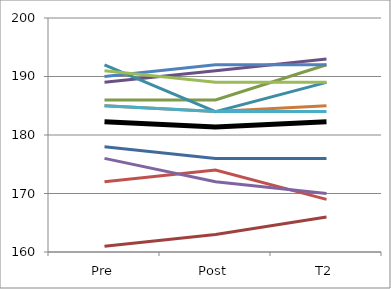
| Category | Series 0 | Series 1 | Series 2 | Series 3 | Series 4 | Series 5 | Series 6 | Series 7 | Series 8 | Series 9 | Series 10 | Mean |
|---|---|---|---|---|---|---|---|---|---|---|---|---|
| Pre | 178 | 161 | 186 | 189 | 192 | 185 | 190 | 172 | 191 | 176 | 185 | 182.273 |
| Post | 176 | 163 | 186 | 191 | 184 | 184 | 192 | 174 | 189 | 172 | 184 | 181.364 |
| T2 | 176 | 166 | 192 | 193 | 189 | 185 | 192 | 169 | 189 | 170 | 184 | 182.273 |